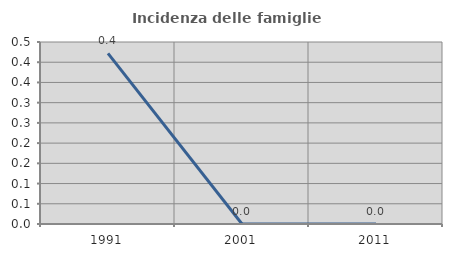
| Category | Incidenza delle famiglie numerose |
|---|---|
| 1991.0 | 0.422 |
| 2001.0 | 0 |
| 2011.0 | 0 |